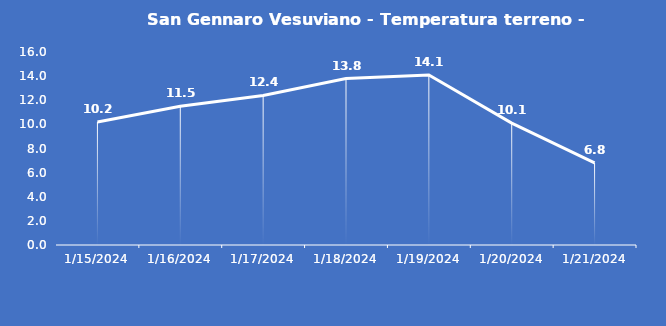
| Category | San Gennaro Vesuviano - Temperatura terreno - Grezzo (°C) |
|---|---|
| 1/15/24 | 10.2 |
| 1/16/24 | 11.5 |
| 1/17/24 | 12.4 |
| 1/18/24 | 13.8 |
| 1/19/24 | 14.1 |
| 1/20/24 | 10.1 |
| 1/21/24 | 6.8 |